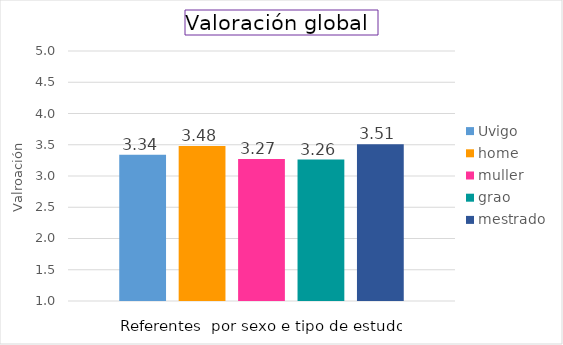
| Category | Uvigo | home | muller  | grao | mestrado |
|---|---|---|---|---|---|
| Índice | 3.339 | 3.478 | 3.271 | 3.264 | 3.509 |